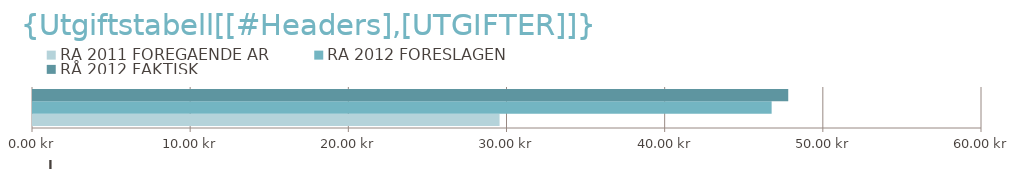
| Category | RÅ 2011 | RÅ 2012 |
|---|---|---|
| 0 | 29500 | 47750 |